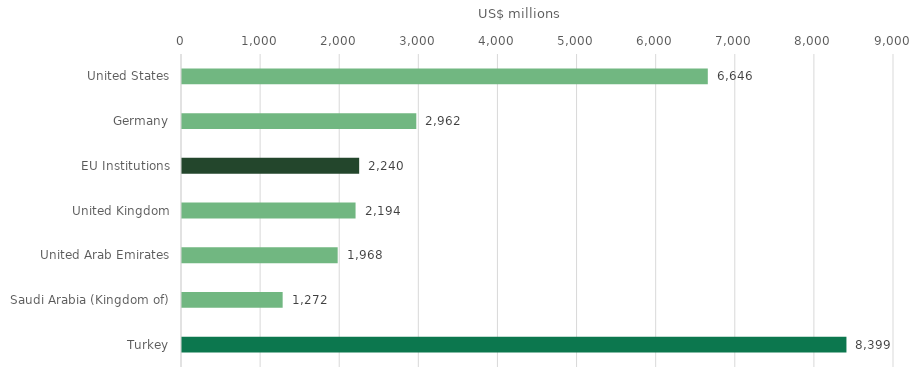
| Category | 2018 |
|---|---|
| United States | 6646.361 |
| Germany | 2961.808 |
| EU Institutions | 2239.548 |
| United Kingdom | 2193.814 |
| United Arab Emirates | 1967.843 |
| Saudi Arabia (Kingdom of) | 1272.307 |
| Turkey | 8398.902 |